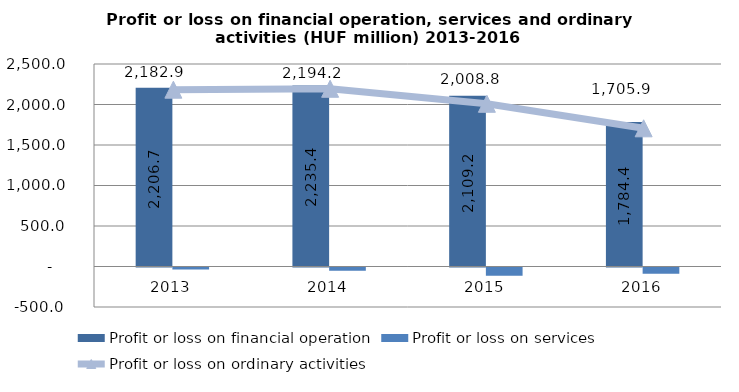
| Category | Profit or loss on financial operation | Profit or loss on services |
|---|---|---|
| 2013.0 | 2206.7 | -23.8 |
| 2014.0 | 2235.4 | -41.2 |
| 2015.0 | 2109.233 | -100.427 |
| 2016.0 | 1784.4 | -78.5 |